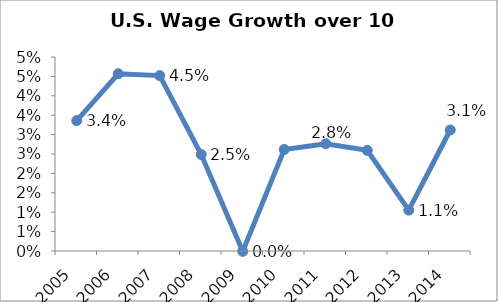
| Category | Wage Growth |
|---|---|
| 2005.0 | 0.034 |
| 2006.0 | 0.046 |
| 2007.0 | 0.045 |
| 2008.0 | 0.025 |
| 2009.0 | 0 |
| 2010.0 | 0.026 |
| 2011.0 | 0.028 |
| 2012.0 | 0.026 |
| 2013.0 | 0.011 |
| 2014.0 | 0.031 |